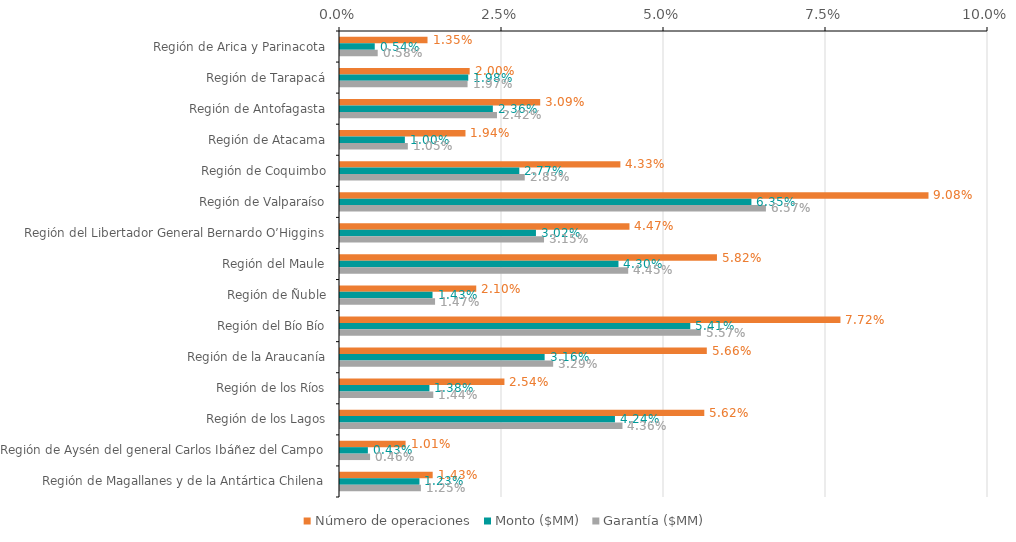
| Category | Número de operaciones | Monto ($MM) | Garantía ($MM) |
|---|---|---|---|
| Región de Arica y Parinacota | 0.014 | 0.005 | 0.006 |
| Región de Tarapacá | 0.02 | 0.02 | 0.02 |
| Región de Antofagasta | 0.031 | 0.024 | 0.024 |
| Región de Atacama | 0.019 | 0.01 | 0.01 |
| Región de Coquimbo | 0.043 | 0.028 | 0.029 |
| Región de Valparaíso | 0.091 | 0.063 | 0.066 |
| Región del Libertador General Bernardo O’Higgins | 0.045 | 0.03 | 0.031 |
| Región del Maule | 0.058 | 0.043 | 0.044 |
| Región de Ñuble | 0.021 | 0.014 | 0.015 |
| Región del Bío Bío | 0.077 | 0.054 | 0.056 |
| Región de la Araucanía | 0.057 | 0.032 | 0.033 |
| Región de los Ríos | 0.025 | 0.014 | 0.014 |
| Región de los Lagos | 0.056 | 0.042 | 0.044 |
| Región de Aysén del general Carlos Ibáñez del Campo | 0.01 | 0.004 | 0.005 |
| Región de Magallanes y de la Antártica Chilena | 0.014 | 0.012 | 0.012 |